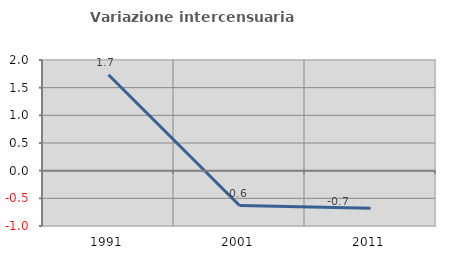
| Category | Variazione intercensuaria annua |
|---|---|
| 1991.0 | 1.734 |
| 2001.0 | -0.63 |
| 2011.0 | -0.681 |